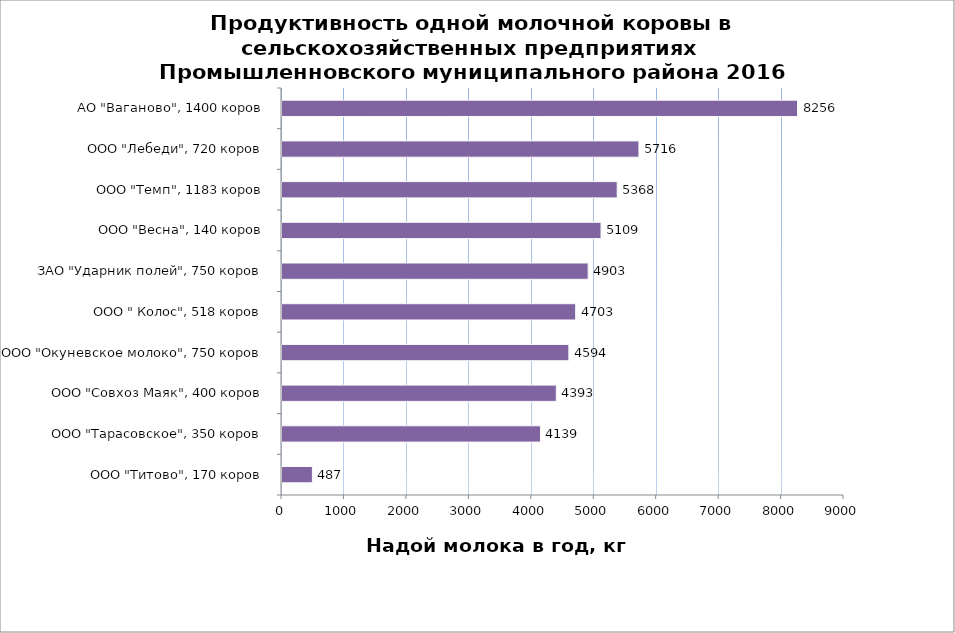
| Category | Series 0 |
|---|---|
| ООО "Титово", 170 коров | 487 |
| ООО "Тарасовское", 350 коров | 4139 |
| ООО "Совхоз Маяк", 400 коров | 4393 |
| ООО "Окуневское молоко", 750 коров | 4594 |
| ООО " Колос", 518 коров | 4703 |
| ЗАО "Ударник полей", 750 коров | 4903 |
| ООО "Весна", 140 коров | 5109 |
| ООО "Темп", 1183 коров | 5368 |
| ООО "Лебеди", 720 коров | 5716 |
| АО "Ваганово", 1400 коров | 8256 |